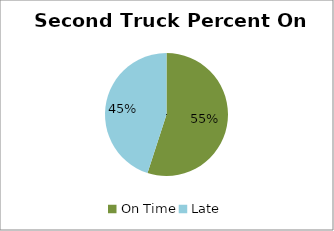
| Category | Series 0 |
|---|---|
| On Time | 0.55 |
| Late | 0.45 |